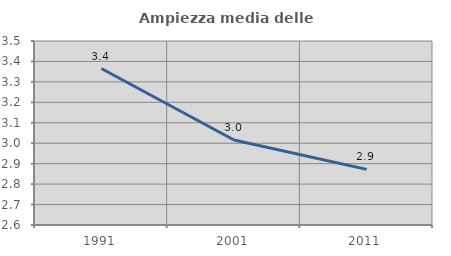
| Category | Ampiezza media delle famiglie |
|---|---|
| 1991.0 | 3.365 |
| 2001.0 | 3.016 |
| 2011.0 | 2.872 |